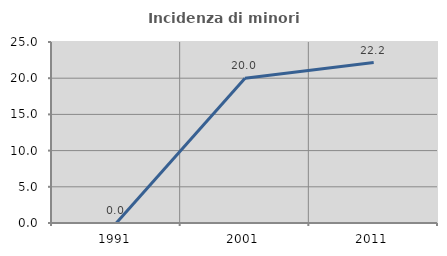
| Category | Incidenza di minori stranieri |
|---|---|
| 1991.0 | 0 |
| 2001.0 | 20 |
| 2011.0 | 22.156 |